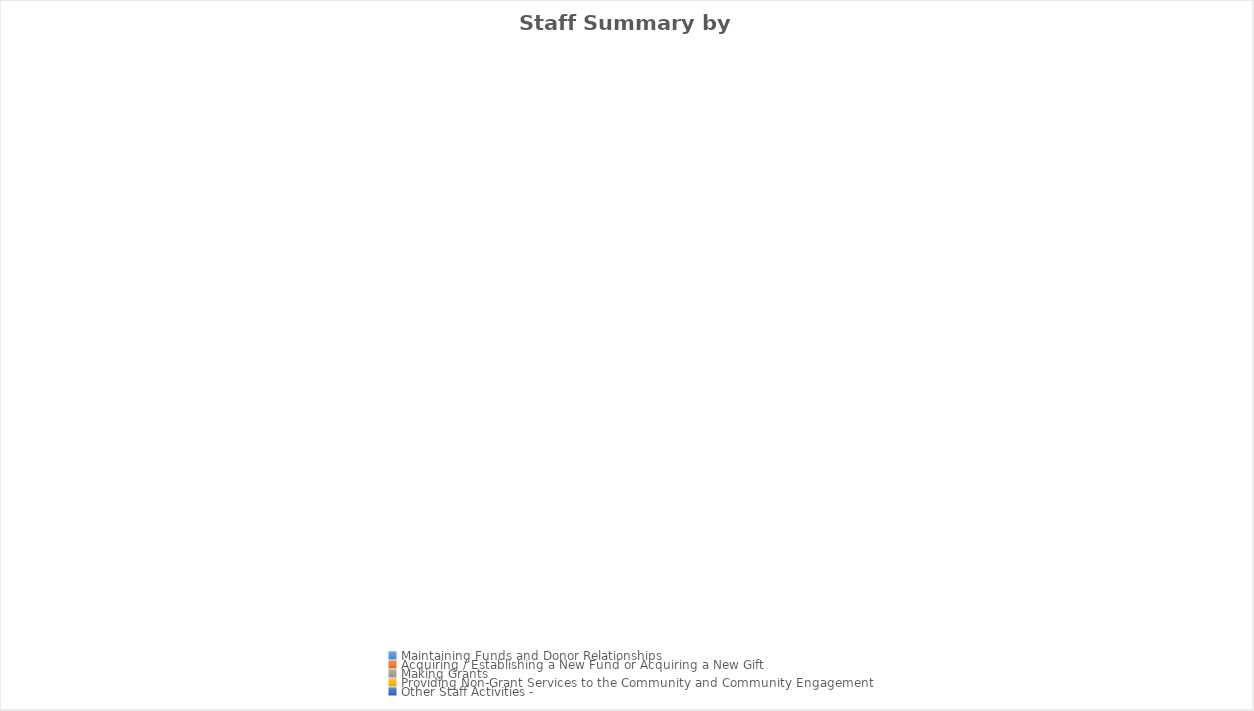
| Category | Staff Summary by Task |
|---|---|
| Maintaining Funds and Donor Relationships | 0 |
| Acquiring / Establishing a New Fund or Acquiring a New Gift | 0 |
| Making Grants | 0 |
| Providing Non-Grant Services to the Community and Community Engagement | 0 |
| Other Staff Activities -  | 0 |